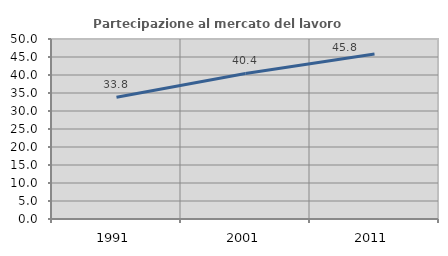
| Category | Partecipazione al mercato del lavoro  femminile |
|---|---|
| 1991.0 | 33.811 |
| 2001.0 | 40.441 |
| 2011.0 | 45.815 |